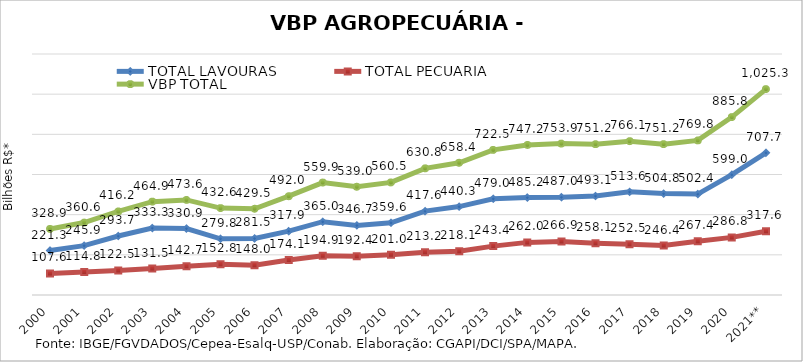
| Category | TOTAL LAVOURAS | TOTAL PECUÁRIA | VBP TOTAL |
|---|---|---|---|
| 2000 | 221.336 | 107.589 | 328.925 |
| 2001 | 245.863 | 114.784 | 360.647 |
| 2002 | 293.692 | 122.533 | 416.225 |
| 2003 | 333.338 | 131.517 | 464.856 |
| 2004 | 330.898 | 142.659 | 473.556 |
| 2005 | 279.759 | 152.822 | 432.581 |
| 2006 | 281.468 | 148.01 | 429.478 |
| 2007 | 317.867 | 174.126 | 491.993 |
| 2008 | 364.99 | 194.888 | 559.878 |
| 2009 | 346.692 | 192.353 | 539.045 |
| 2010 | 359.558 | 200.972 | 560.53 |
| 2011 | 417.582 | 213.18 | 630.762 |
| 2012 | 440.29 | 218.07 | 658.36 |
| 2013 | 479.038 | 243.449 | 722.487 |
| 2014 | 485.201 | 262.02 | 747.222 |
| 2015 | 486.962 | 266.927 | 753.889 |
| 2016 | 493.12 | 258.052 | 751.172 |
| 2017 | 513.608 | 252.507 | 766.115 |
| 2018 | 504.827 | 246.4 | 751.228 |
| 2019 | 502.409 | 267.415 | 769.824 |
| 2020 | 598.965 | 286.814 | 885.779 |
| 2021** | 707.723 | 317.561 | 1025.284 |